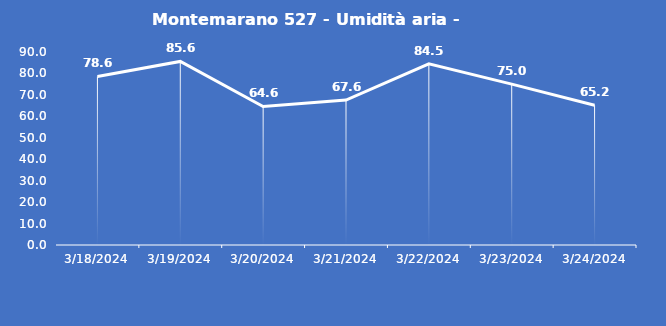
| Category | Montemarano 527 - Umidità aria - Grezzo (%) |
|---|---|
| 3/18/24 | 78.6 |
| 3/19/24 | 85.6 |
| 3/20/24 | 64.6 |
| 3/21/24 | 67.6 |
| 3/22/24 | 84.5 |
| 3/23/24 | 75 |
| 3/24/24 | 65.2 |